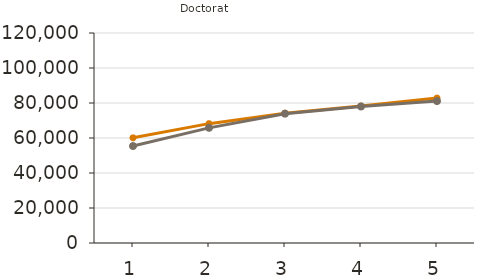
| Category | Moyens | Médians |
|---|---|---|
| 1.0 | 60100 | 55400 |
| 2.0 | 68200 | 65800 |
| 3.0 | 74200 | 73900 |
| 4.0 | 78300 | 78000 |
| 5.0 | 82800 | 81100 |